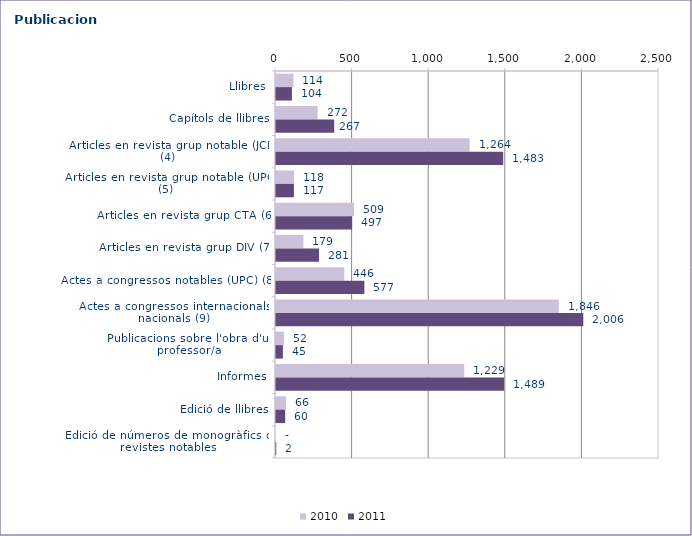
| Category | 2010 | 2011 |
|---|---|---|
| Llibres | 114 | 104 |
| Capítols de llibres | 272 | 380 |
| Articles en revista grup notable (JCR) (4) | 1264 | 1483 |
| Articles en revista grup notable (UPC) (5) | 118 | 117 |
| Articles en revista grup CTA (6) | 509 | 497 |
| Articles en revista grup DIV (7) | 179 | 281 |
| Actes a congressos notables (UPC) (8) | 446 | 577 |
| Actes a congressos internacionals i nacionals (9) | 1846 | 2006 |
| Publicacions sobre l'obra d'un professor/a | 52 | 45 |
| Informes | 1229 | 1489 |
| Edició de llibres | 66 | 60 |
| Edició de números de monogràfics de revistes notables | 0 | 2 |